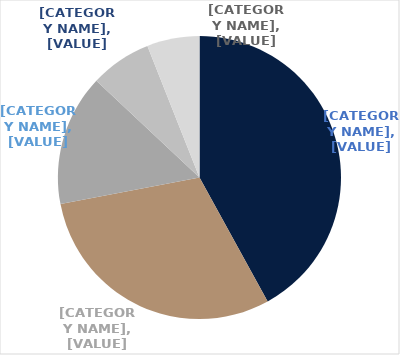
| Category | Series 0 |
|---|---|
| Regional | 0.42 |
| Sub regional | 0.3 |
| Outlet | 0.15 |
| Neighbourhood | 0.07 |
| CBD Retail | 0.06 |